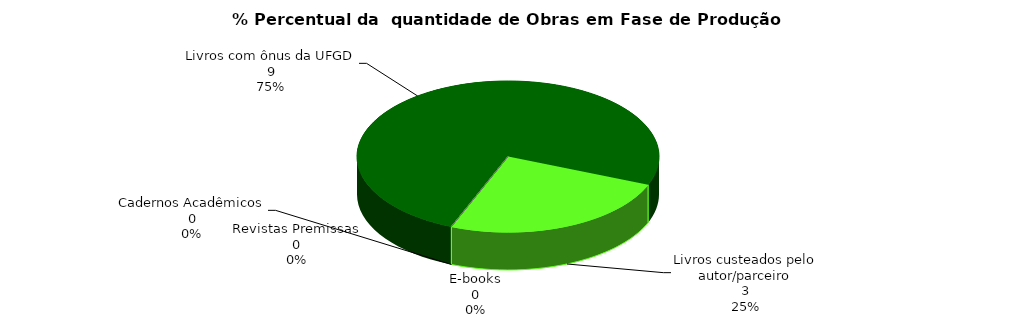
| Category | Series 0 |
|---|---|
| 0 | 9 |
| 1 | 3 |
| 2 | 0 |
| 3 | 0 |
| 4 | 0 |